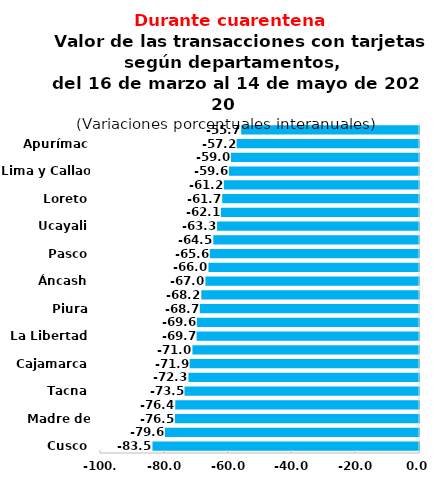
| Category | Var.% |
|---|---|
| Cusco | -83.549 |
| Puno | -79.631 |
| Madre de Dios | -76.529 |
| Junín | -76.412 |
| Tacna | -73.506 |
| Ayacucho | -72.269 |
| Cajamarca | -71.893 |
| Arequipa | -71.024 |
| La Libertad | -69.734 |
| Lambayeque | -69.627 |
| Piura | -68.712 |
| Huánuco | -68.24 |
| Áncash | -66.955 |
| Ica | -66 |
| Pasco | -65.584 |
| Moquegua | -64.481 |
| Ucayali | -63.307 |
| San Martín | -62.107 |
| Loreto | -61.685 |
| Amazonas | -61.189 |
| Lima y Callao | -59.579 |
| Tumbes | -58.963 |
| Apurímac | -57.169 |
| Huancavelica | -55.739 |